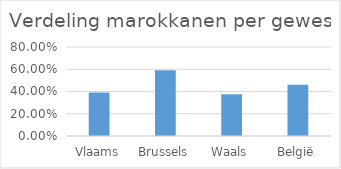
| Category | Series 0 |
|---|---|
| Vlaams | 0.39 |
| Brussels | 0.592 |
| Waals | 0.375 |
| België | 0.46 |